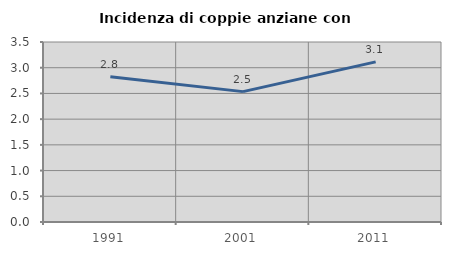
| Category | Incidenza di coppie anziane con figli |
|---|---|
| 1991.0 | 2.825 |
| 2001.0 | 2.535 |
| 2011.0 | 3.114 |